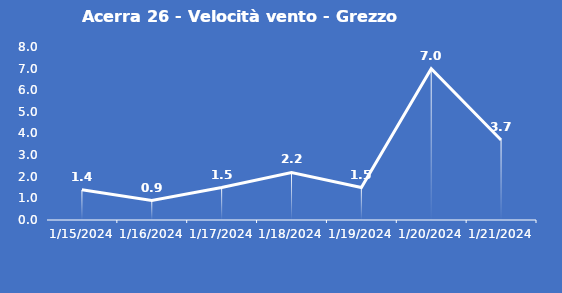
| Category | Acerra 26 - Velocità vento - Grezzo (m/s) |
|---|---|
| 1/15/24 | 1.4 |
| 1/16/24 | 0.9 |
| 1/17/24 | 1.5 |
| 1/18/24 | 2.2 |
| 1/19/24 | 1.5 |
| 1/20/24 | 7 |
| 1/21/24 | 3.7 |